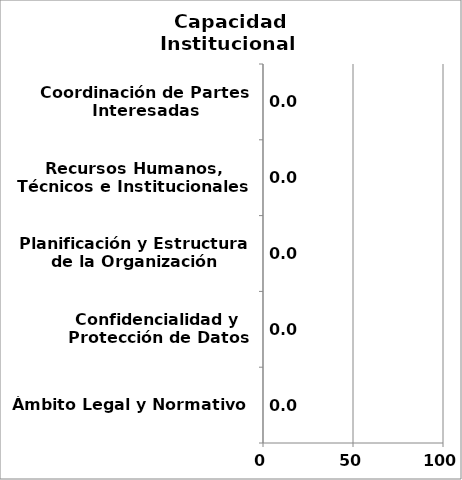
| Category | Series 0 |
|---|---|
| Ámbito Legal y Normativo | 0 |
| Confidencialidad y Protección de Datos | 0 |
| Planificación y Estructura de la Organización | 0 |
| Recursos Humanos, Técnicos e Institucionales | 0 |
| Coordinación de Partes Interesadas | 0 |